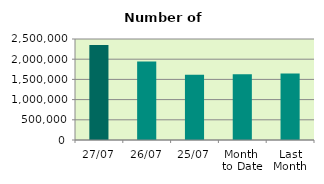
| Category | Series 0 |
|---|---|
| 27/07 | 2351210 |
| 26/07 | 1941544 |
| 25/07 | 1612052 |
| Month 
to Date | 1629666.526 |
| Last
Month | 1646651.818 |